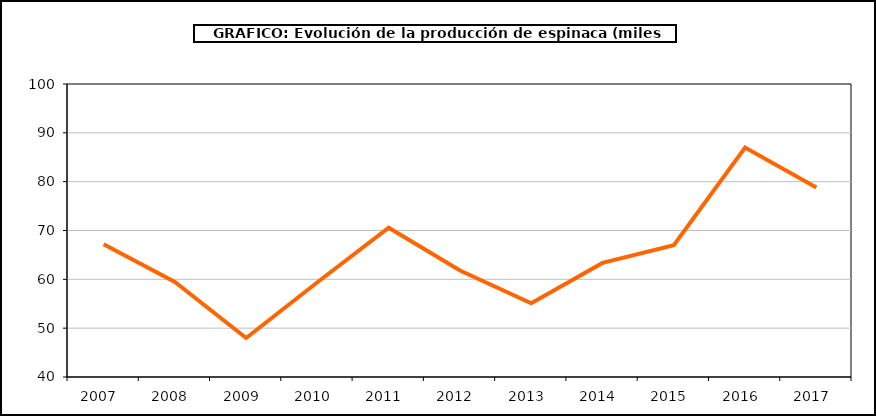
| Category | producción |
|---|---|
| 2007.0 | 67.167 |
| 2008.0 | 59.476 |
| 2009.0 | 47.983 |
| 2010.0 | 59.403 |
| 2011.0 | 70.571 |
| 2012.0 | 61.814 |
| 2013.0 | 55.11 |
| 2014.0 | 63.364 |
| 2015.0 | 66.989 |
| 2016.0 | 86.99 |
| 2017.0 | 78.802 |